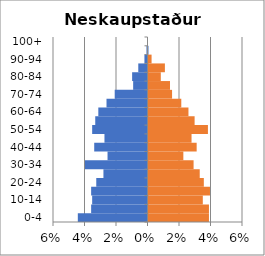
| Category | % Men | % Women |
|---|---|---|
| 0-4 | -0.044 | 0.038 |
| 5-9 | -0.036 | 0.038 |
| 10-14 | -0.035 | 0.034 |
| 15-19 | -0.036 | 0.039 |
| 20-24 | -0.033 | 0.035 |
| 25-29 | -0.028 | 0.033 |
| 30-34 | -0.04 | 0.029 |
| 35-39 | -0.025 | 0.022 |
| 40-44 | -0.034 | 0.031 |
| 45-49 | -0.027 | 0.027 |
| 50-54 | -0.035 | 0.038 |
| 55-59 | -0.033 | 0.029 |
| 60-64 | -0.031 | 0.025 |
| 65-69 | -0.026 | 0.021 |
| 70-74 | -0.021 | 0.015 |
| 75-79 | -0.009 | 0.014 |
| 80-84 | -0.01 | 0.008 |
| 85-89 | -0.006 | 0.01 |
| 90-94 | -0.002 | 0.002 |
| 95-99 | -0.001 | 0 |
| 100+ | 0 | 0 |